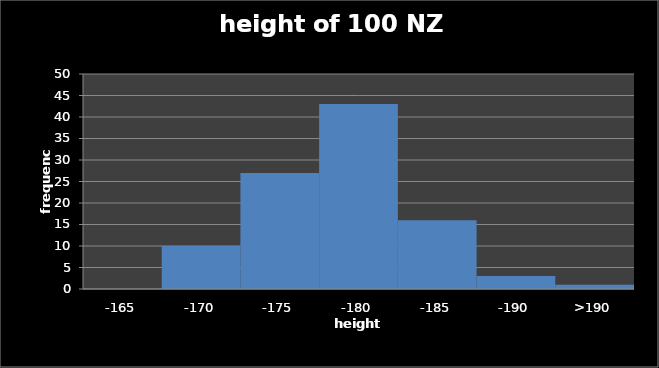
| Category | sample 30 |
|---|---|
| -165 | 0 |
| -170 | 10 |
| -175 | 27 |
| -180 | 43 |
| -185 | 16 |
| -190 | 3 |
| >190 | 1 |